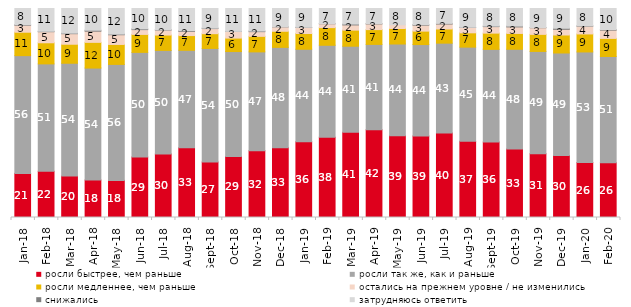
| Category | росли быстрее, чем раньше | росли так же, как и раньше | росли медленнее, чем раньше | остались на прежнем уровне / не изменились | снижались | затрудняюсь ответить |
|---|---|---|---|---|---|---|
| 2018-01-01 | 21.1 | 56.35 | 11.2 | 3.35 | 0.25 | 7.75 |
| 2018-02-01 | 22.1 | 51.4 | 10.1 | 5.3 | 0.2 | 10.9 |
| 2018-03-01 | 19.8 | 54 | 9.1 | 5.05 | 0.25 | 11.8 |
| 2018-04-01 | 17.95 | 53.55 | 12.3 | 5.35 | 0.45 | 10.4 |
| 2018-05-01 | 17.75 | 55.5 | 9.55 | 4.65 | 0.3 | 12.25 |
| 2018-06-01 | 28.9 | 50.1 | 8.6 | 2.3 | 0.35 | 9.75 |
| 2018-07-01 | 30.35 | 49.6 | 7.35 | 2.4 | 0.15 | 10.15 |
| 2018-08-01 | 33.35 | 46.65 | 7.05 | 2 | 0.35 | 10.6 |
| 2018-09-01 | 26.55 | 54.35 | 7.05 | 2.45 | 0.2 | 9.4 |
| 2018-10-01 | 29.2 | 50.2 | 6.45 | 3.15 | 0.05 | 10.95 |
| 2018-11-01 | 31.886 | 47.355 | 7.435 | 2.246 | 0.299 | 10.778 |
| 2018-12-01 | 33.4 | 48 | 7.7 | 2.1 | 0.05 | 8.75 |
| 2019-01-01 | 36.25 | 44.25 | 7.55 | 2.85 | 0.1 | 9 |
| 2019-02-01 | 38.35 | 44.05 | 8.45 | 1.85 | 0.05 | 7.25 |
| 2019-03-01 | 40.825 | 41.124 | 7.708 | 2.486 | 0.398 | 7.459 |
| 2019-04-01 | 42.03 | 40.792 | 7.079 | 2.723 | 0.149 | 7.228 |
| 2019-05-01 | 39.079 | 43.933 | 7.429 | 1.783 | 0 | 7.776 |
| 2019-06-01 | 39.052 | 43.691 | 6.434 | 2.843 | 0.249 | 7.731 |
| 2019-07-01 | 40.396 | 43.02 | 6.782 | 2.376 | 0.297 | 7.129 |
| 2019-08-01 | 36.513 | 45.005 | 6.843 | 2.547 | 0.1 | 8.991 |
| 2019-09-01 | 36.139 | 44.307 | 7.772 | 3.119 | 0.248 | 8.416 |
| 2019-10-01 | 32.822 | 47.673 | 7.574 | 3.119 | 0.396 | 8.416 |
| 2019-11-01 | 30.545 | 48.911 | 8.168 | 3.168 | 0.099 | 9.109 |
| 2019-12-01 | 29.653 | 49.059 | 8.614 | 2.723 | 0.495 | 9.455 |
| 2020-01-01 | 26.287 | 52.921 | 8.614 | 3.713 | 0.149 | 8.317 |
| 2020-02-01 | 26.139 | 50.891 | 8.663 | 3.96 | 0.297 | 10.05 |